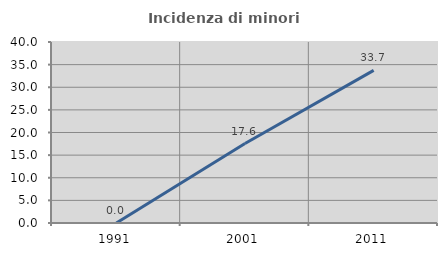
| Category | Incidenza di minori stranieri |
|---|---|
| 1991.0 | 0 |
| 2001.0 | 17.568 |
| 2011.0 | 33.735 |